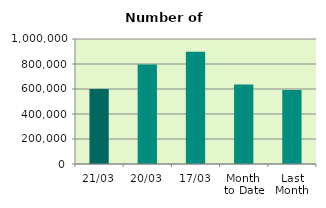
| Category | Series 0 |
|---|---|
| 21/03 | 599824 |
| 20/03 | 795660 |
| 17/03 | 898676 |
| Month 
to Date | 635913.067 |
| Last
Month | 592303 |